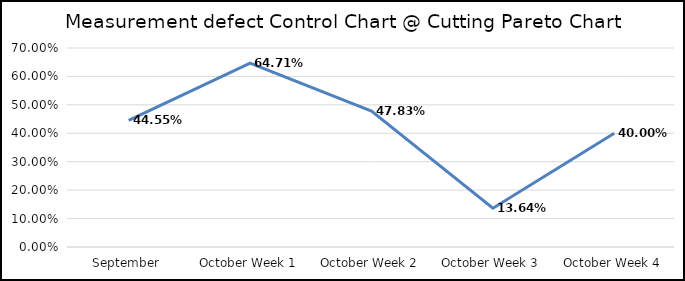
| Category | Defect % |
|---|---|
| September | 0.446 |
| October Week 1 | 0.647 |
| October Week 2 | 0.478 |
| October Week 3 | 0.136 |
| October Week 4 | 0.4 |